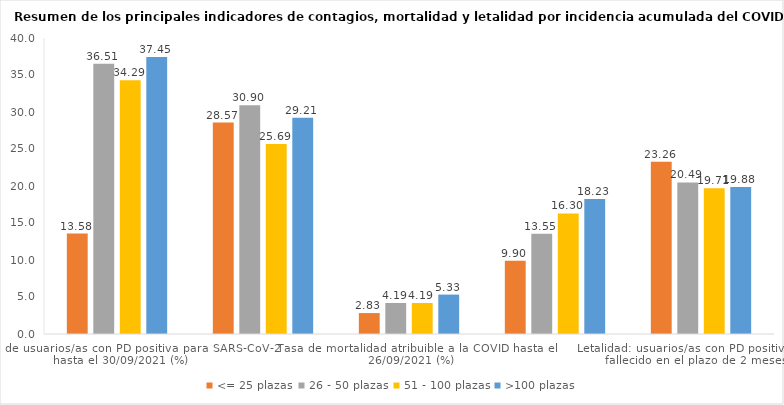
| Category | <= 25 plazas | 26 - 50 plazas | 51 - 100 plazas | >100 plazas |
|---|---|---|---|---|
| Tasa de usuarios/as con PD positiva para SARS-CoV-2 hasta el 30/09/2021 (%) | 13.576 | 36.514 | 34.288 | 37.448 |
| Tasa de mortalidad por todas las causas hasta el 26/09/2021 (%) | 28.566 | 30.897 | 25.69 | 29.214 |
| Tasa de mortalidad atribuible a la COVID hasta el 26/09/2021 (%) | 2.828 | 4.188 | 4.187 | 5.326 |
| Proporción de los fallecimientos totales atribuibles a la COVID hasta el 26/09/2021 (%) | 9.901 | 13.554 | 16.298 | 18.233 |
| Letalidad: usuarios/as con PD positiva que han fallecido en el plazo de 2 meses (%) | 23.264 | 20.49 | 19.712 | 19.881 |